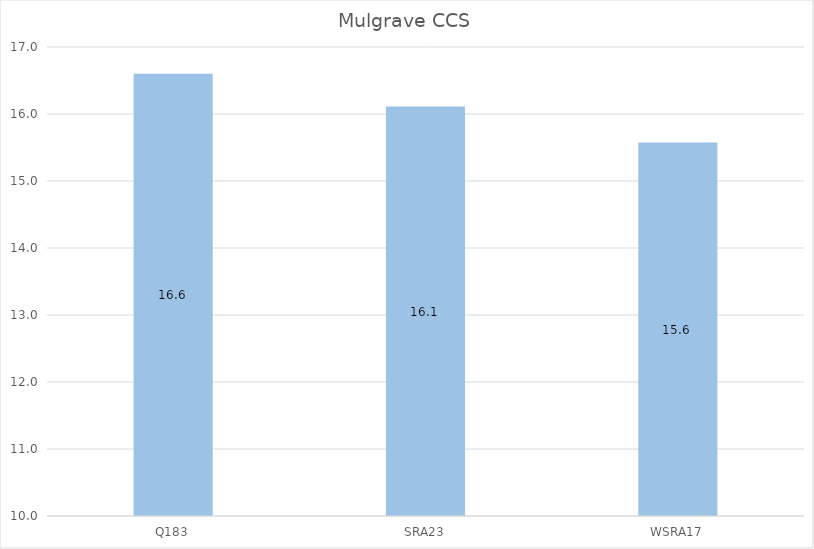
| Category | Plant |
|---|---|
| Q183 | 16.601 |
| SRA23 | 16.111 |
| WSRA17 | 15.574 |